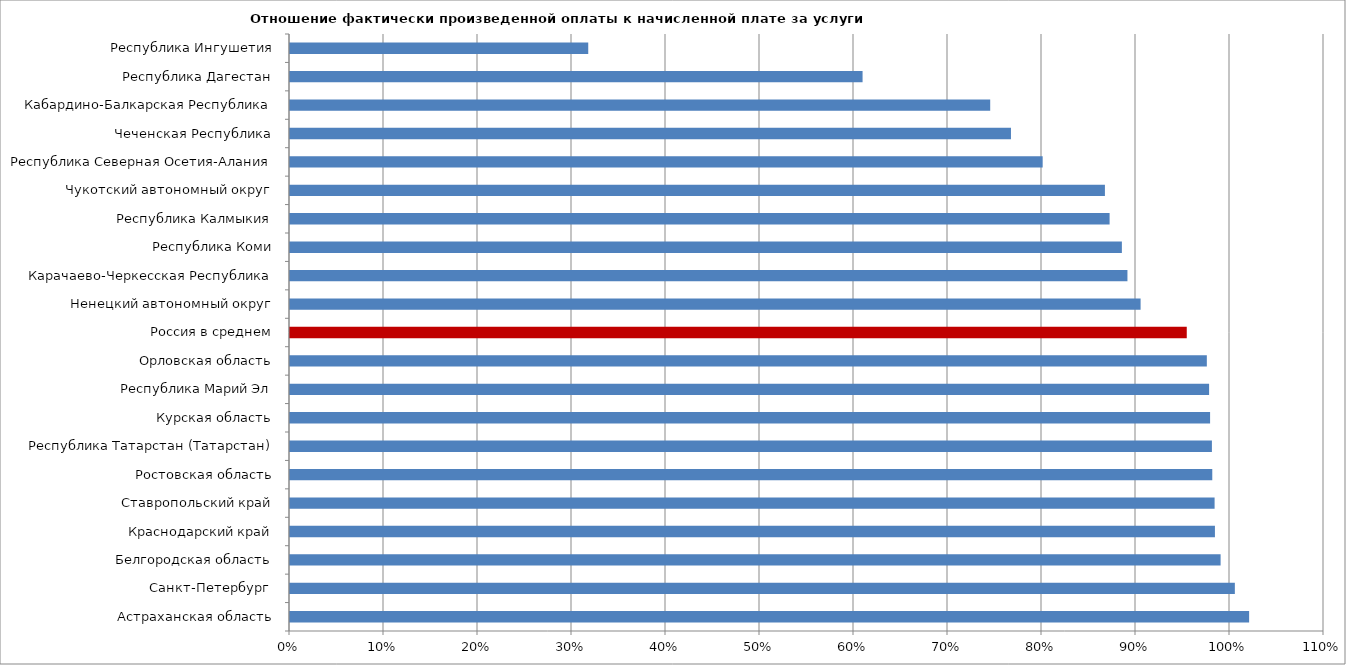
| Category | Отношение фактически произведенной оплаты к начисленной плате за услуги ЖКХ (%) |
|---|---|
| Астраханская область | 1.02 |
| Санкт-Петербург  | 1.005 |
| Белгородская область | 0.99 |
| Краснодарский край | 0.984 |
| Ставропольский край | 0.984 |
| Ростовская область | 0.981 |
| Республика Татарстан (Татарстан) | 0.981 |
| Курская область | 0.979 |
| Республика Марий Эл | 0.978 |
| Орловская область | 0.975 |
| Россия в среднем | 0.954 |
| Ненецкий автономный округ | 0.905 |
| Карачаево-Черкесская Республика | 0.891 |
| Республика Коми | 0.885 |
| Республика Калмыкия | 0.872 |
| Чукотский автономный округ | 0.867 |
| Республика Северная Осетия-Алания | 0.801 |
| Чеченская Республика | 0.767 |
| Кабардино-Балкарская Республика | 0.745 |
| Республика Дагестан | 0.609 |
| Республика Ингушетия | 0.317 |